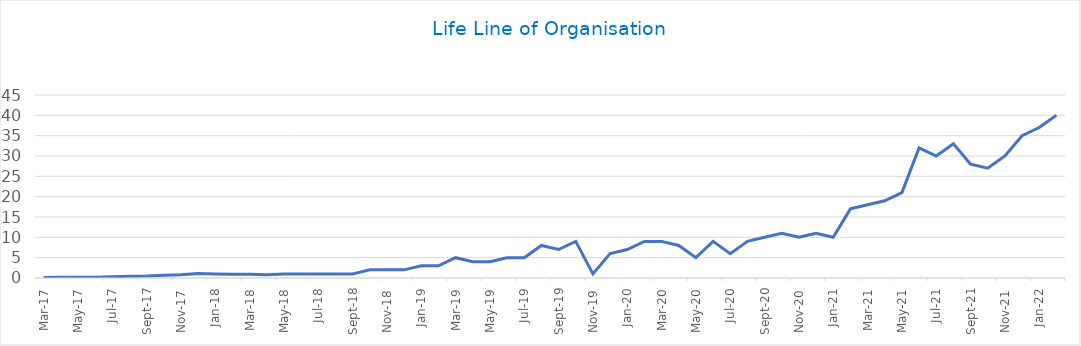
| Category | Sales Revenue |
|---|---|
| 2022-02-01 | 40 |
| 2022-01-02 | 37 |
| 2021-12-01 | 35 |
| 2021-11-01 | 30 |
| 2021-10-02 | 27 |
| 2021-09-02 | 28 |
| 2021-08-03 | 33 |
| 2021-07-04 | 30 |
| 2021-06-04 | 32 |
| 2021-05-05 | 21 |
| 2021-04-05 | 19 |
| 2021-03-06 | 18 |
| 2021-02-04 | 17 |
| 2021-01-05 | 10 |
| 2020-12-06 | 11 |
| 2020-11-06 | 10 |
| 2020-10-07 | 11 |
| 2020-09-07 | 10 |
| 2020-08-08 | 9 |
| 2020-07-09 | 6 |
| 2020-06-09 | 9 |
| 2020-05-10 | 5 |
| 2020-04-10 | 8 |
| 2020-03-11 | 9 |
| 2020-02-10 | 9 |
| 2020-01-11 | 7 |
| 2019-12-12 | 6 |
| 2019-11-12 | 1 |
| 2019-10-13 | 9 |
| 2019-09-13 | 7 |
| 2019-08-14 | 8 |
| 2019-07-15 | 5 |
| 2019-06-15 | 5 |
| 2019-05-16 | 4 |
| 2019-04-16 | 4 |
| 2019-03-17 | 5 |
| 2019-02-15 | 3 |
| 2019-01-16 | 3 |
| 2018-12-17 | 2 |
| 2018-11-17 | 2 |
| 2018-10-18 | 2 |
| 2018-09-18 | 1 |
| 2018-08-19 | 1 |
| 2018-07-20 | 1 |
| 2018-06-20 | 1 |
| 2018-05-21 | 1 |
| 2018-04-21 | 0.8 |
| 2018-03-22 | 0.9 |
| 2018-02-20 | 0.9 |
| 2018-01-21 | 1 |
| 2017-12-22 | 1.1 |
| 2017-11-22 | 0.8 |
| 2017-10-23 | 0.7 |
| 2017-09-23 | 0.5 |
| 2017-08-24 | 0.4 |
| 2017-07-25 | 0.3 |
| 2017-06-25 | 0.2 |
| 2017-05-26 | 0.2 |
| 2017-04-26 | 0.2 |
| 2017-03-27 | 0.1 |